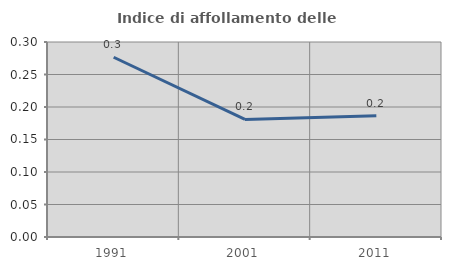
| Category | Indice di affollamento delle abitazioni  |
|---|---|
| 1991.0 | 0.277 |
| 2001.0 | 0.181 |
| 2011.0 | 0.187 |